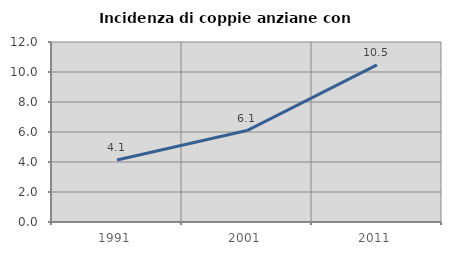
| Category | Incidenza di coppie anziane con figli |
|---|---|
| 1991.0 | 4.138 |
| 2001.0 | 6.098 |
| 2011.0 | 10.479 |